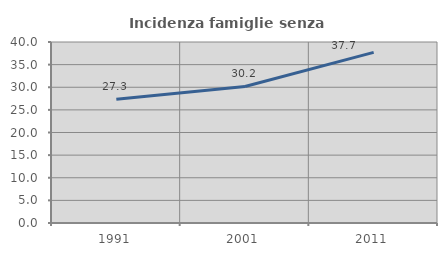
| Category | Incidenza famiglie senza nuclei |
|---|---|
| 1991.0 | 27.326 |
| 2001.0 | 30.18 |
| 2011.0 | 37.711 |